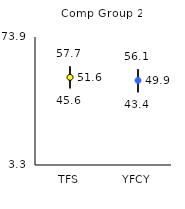
| Category | 25th | 75th | Mean |
|---|---|---|---|
| TFS | 45.6 | 57.7 | 51.64 |
| YFCY | 43.4 | 56.1 | 49.92 |